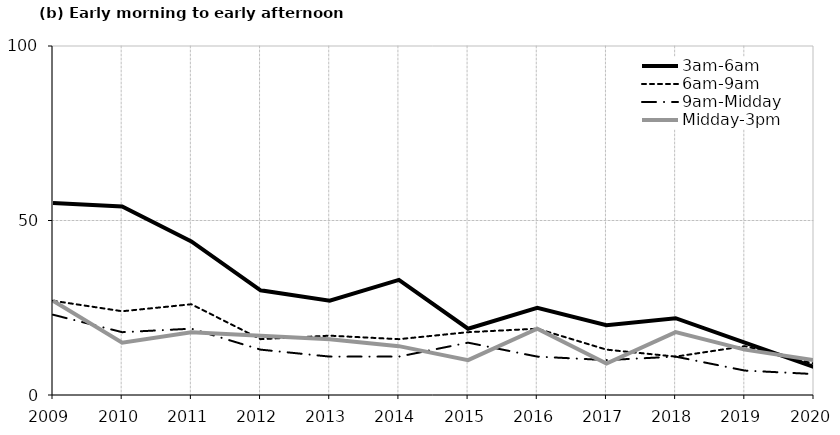
| Category | 3am-6am | 6am-9am | 9am-Midday | Midday-3pm |
|---|---|---|---|---|
| 2009.0 | 55 | 27 | 23 | 27 |
| 2010.0 | 54 | 24 | 18 | 15 |
| 2011.0 | 44 | 26 | 19 | 18 |
| 2012.0 | 30 | 16 | 13 | 17 |
| 2013.0 | 27 | 17 | 11 | 16 |
| 2014.0 | 33 | 16 | 11 | 14 |
| 2015.0 | 19 | 18 | 15 | 10 |
| 2016.0 | 25 | 19 | 11 | 19 |
| 2017.0 | 20 | 13 | 10 | 9 |
| 2018.0 | 22 | 11 | 11 | 18 |
| 2019.0 | 15 | 14 | 7 | 13 |
| 2020.0 | 8 | 9 | 6 | 10 |